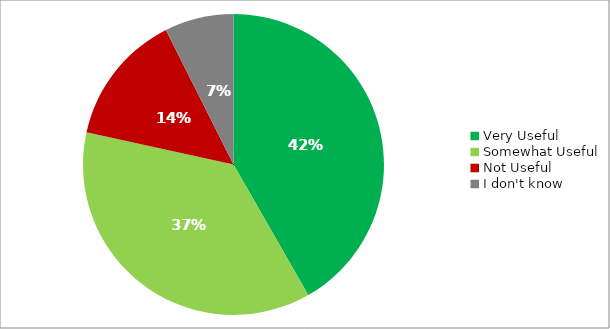
| Category | Responses |
|---|---|
| Very Useful | 0.417 |
| Somewhat Useful | 0.367 |
| Not Useful | 0.141 |
| I don't know | 0.074 |